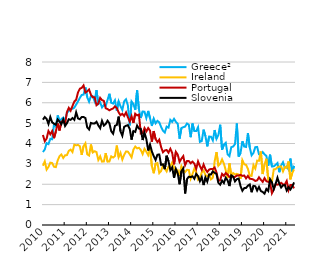
| Category | Greece² | Ireland | Portugal | Slovenia |
|---|---|---|---|---|
| 2010-01-31 | 3.58 | 2.91 | 4.42 | 5.17 |
| 2010-02-28 | 3.71 | 3.12 | 4.11 | 5.3 |
| 2010-03-31 | 4.02 | 2.72 | 4.24 | 5.21 |
| 2010-04-30 | 3.97 | 2.85 | 4.61 | 4.96 |
| 2010-05-31 | 4.23 | 3.06 | 4.45 | 5.3 |
| 2010-06-30 | 4.21 | 3.04 | 4.61 | 5.04 |
| 2010-07-31 | 4.94 | 2.86 | 4.26 | 4.97 |
| 2010-08-31 | 4.83 | 2.84 | 4.59 | 4.92 |
| 2010-09-30 | 5.38 | 3.17 | 4.98 | 5.18 |
| 2010-10-31 | 5.09 | 3.38 | 4.64 | 5.07 |
| 2010-11-30 | 5.2 | 3.46 | 5.07 | 4.95 |
| 2010-12-31 | 5.27 | 3.29 | 5.12 | 5.18 |
| 2011-01-31 | 5.12 | 3.42 | 4.97 | 4.86 |
| 2011-02-28 | 5.5 | 3.43 | 5.54 | 5 |
| 2011-03-31 | 5.6 | 3.64 | 5.75 | 5.19 |
| 2011-04-30 | 5.7 | 3.7 | 5.61 | 5.16 |
| 2011-05-31 | 5.7 | 3.58 | 5.84 | 5.25 |
| 2011-06-30 | 5.76 | 3.94 | 6.06 | 5.16 |
| 2011-07-31 | 5.91 | 3.91 | 6.15 | 5.53 |
| 2011-08-31 | 6.07 | 3.93 | 6.51 | 5.23 |
| 2011-09-30 | 6.24 | 3.87 | 6.69 | 5.19 |
| 2011-10-31 | 6.38 | 3.44 | 6.73 | 5.3 |
| 2011-11-30 | 6.4 | 3.87 | 6.85 | 5.3 |
| 2011-12-31 | 6.75 | 4.01 | 6.5 | 5.25 |
| 2012-01-31 | 6.27 | 3.47 | 6.56 | 4.79 |
| 2012-02-29 | 6.05 | 3.41 | 6.65 | 4.69 |
| 2012-03-31 | 6.33 | 3.95 | 6.39 | 5.01 |
| 2012-04-30 | 6.32 | 3.56 | 6.27 | 4.98 |
| 2012-05-31 | 6.08 | 3.62 | 6.27 | 4.98 |
| 2012-06-30 | 6.62 | 3.58 | 5.88 | 5.07 |
| 2012-07-31 | 5.94 | 3.19 | 5.96 | 4.89 |
| 2012-08-31 | 6.02 | 3.37 | 6.24 | 4.75 |
| 2012-09-30 | 5.77 | 3.11 | 6.13 | 5.11 |
| 2012-10-31 | 5.89 | 3.12 | 6.09 | 4.88 |
| 2012-11-30 | 5.85 | 3.53 | 5.73 | 4.96 |
| 2012-12-31 | 6.14 | 3.11 | 5.69 | 5.12 |
| 2013-01-31 | 6.44 | 3.12 | 5.63 | 4.99 |
| 2013-02-28 | 6 | 3.37 | 5.68 | 4.6 |
| 2013-03-31 | 5.96 | 3.31 | 5.72 | 4.48 |
| 2013-04-30 | 6.12 | 3.38 | 5.82 | 4.87 |
| 2013-05-31 | 5.61 | 3.9 | 5.74 | 4.91 |
| 2013-06-30 | 6.07 | 3.33 | 5.53 | 5.32 |
| 2013-07-31 | 5.83 | 3.54 | 5.39 | 4.6 |
| 2013-08-31 | 5.65 | 3.21 | 5.46 | 4.38 |
| 2013-09-30 | 6.07 | 3.44 | 5.35 | 4.82 |
| 2013-10-31 | 6.17 | 3.61 | 5.53 | 4.87 |
| 2013-11-30 | 5.87 | 3.6 | 5.29 | 4.9 |
| 2013-12-31 | 4.89 | 3.47 | 5.08 | 4.72 |
| 2014-01-31 | 6.06 | 3.32 | 5.34 | 4.19 |
| 2014-02-28 | 5.93 | 3.7 | 5.01 | 4.61 |
| 2014-03-31 | 5.65 | 3.85 | 5.46 | 4.57 |
| 2014-04-30 | 6.61 | 3.76 | 5.38 | 4.88 |
| 2014-05-31 | 5.66 | 3.79 | 5.42 | 4.73 |
| 2014-06-30 | 5.25 | 3.68 | 4.49 | 4.72 |
| 2014-07-31 | 5.57 | 3.48 | 4.52 | 4.17 |
| 2014-08-31 | 5.56 | 3.74 | 4.76 | 4.53 |
| 2014-09-30 | 5.25 | 3.6 | 4.59 | 4.22 |
| 2014-10-31 | 5.6 | 3.43 | 4.76 | 3.66 |
| 2014-11-30 | 5.24 | 3.77 | 4.63 | 3.95 |
| 2014-12-31 | 4.86 | 2.89 | 4.09 | 3.61 |
| 2015-01-31 | 5.22 | 2.54 | 4.61 | 3.38 |
| 2015-02-28 | 4.99 | 3.01 | 4.22 | 3.19 |
| 2015-03-31 | 5.11 | 3.04 | 4.07 | 3.45 |
| 2015-04-30 | 5.04 | 2.55 | 4.19 | 3.46 |
| 2015-05-31 | 4.81 | 2.65 | 3.82 | 2.95 |
| 2015-06-30 | 4.63 | 2.93 | 3.57 | 2.98 |
| 2015-07-31 | 4.54 | 2.77 | 3.66 | 2.74 |
| 2015-08-31 | 4.83 | 2.63 | 3.68 | 3.4 |
| 2015-09-30 | 4.78 | 2.87 | 3.55 | 3.13 |
| 2015-10-31 | 5.16 | 2.89 | 3.74 | 2.69 |
| 2015-11-30 | 5.06 | 3.07 | 3.54 | 2.83 |
| 2015-12-31 | 5.21 | 2.84 | 2.98 | 2.32 |
| 2016-01-31 | 5.06 | 2.55 | 3.59 | 2.75 |
| 2016-02-29 | 4.97 | 2.68 | 3.45 | 2.53 |
| 2016-03-31 | 4.24 | 2.41 | 3.1 | 2 |
| 2016-04-30 | 4.76 | 2.88 | 3.26 | 2.64 |
| 2016-05-31 | 4.8 | 2.67 | 3.38 | 2.78 |
| 2016-06-30 | 4.83 | 2.6 | 2.94 | 1.55 |
| 2016-07-31 | 4.98 | 2.71 | 3.14 | 2.25 |
| 2016-08-31 | 4.92 | 2.7 | 3.14 | 2.37 |
| 2016-09-30 | 4.31 | 2.27 | 3.03 | 2.35 |
| 2016-10-31 | 4.98 | 2.5 | 3.11 | 2.39 |
| 2016-11-30 | 4.61 | 2.77 | 3.01 | 2.27 |
| 2016-12-31 | 4.61 | 2.6 | 2.76 | 2.51 |
| 2017-01-31 | 4.8 | 2.22 | 3.12 | 2.4 |
| 2017-02-28 | 4.08 | 2.31 | 2.89 | 2.15 |
| 2017-03-31 | 4.12 | 2.58 | 2.71 | 2.35 |
| 2017-04-30 | 4.68 | 2.68 | 2.97 | 1.96 |
| 2017-05-31 | 4.36 | 2.45 | 2.74 | 2.33 |
| 2017-06-30 | 3.86 | 2.39 | 2.6 | 2.13 |
| 2017-07-31 | 4.34 | 2.49 | 2.72 | 2.48 |
| 2017-08-31 | 4.33 | 2.24 | 2.75 | 2.48 |
| 2017-09-30 | 4.15 | 2.32 | 2.74 | 2.63 |
| 2017-10-31 | 4.66 | 3.13 | 2.82 | 2.56 |
| 2017-11-30 | 4.23 | 3.58 | 2.58 | 2.5 |
| 2017-12-31 | 4.41 | 2.91 | 2.16 | 2.07 |
| 2018-01-31 | 4.92 | 3.01 | 2.21 | 1.98 |
| 2018-02-28 | 3.69 | 3.22 | 2.51 | 2.18 |
| 2018-03-31 | 3.94 | 3.01 | 2.41 | 2.06 |
| 2018-04-30 | 4.03 | 2.69 | 2.55 | 2.32 |
| 2018-05-31 | 3.47 | 2.3 | 2.47 | 2.19 |
| 2018-06-30 | 3.38 | 3.02 | 2.36 | 1.91 |
| 2018-07-31 | 3.82 | 2.43 | 2.37 | 2.44 |
| 2018-08-31 | 3.85 | 2.55 | 2.36 | 2.38 |
| 2018-09-30 | 3.97 | 2.48 | 2.36 | 2.14 |
| 2018-10-31 | 4.98 | 2.51 | 2.43 | 2.25 |
| 2018-11-30 | 3.36 | 2.48 | 2.43 | 2.28 |
| 2018-12-31 | 3.54 | 2.26 | 2.46 | 1.91 |
| 2019-01-31 | 4.11 | 3.18 | 2.41 | 1.68 |
| 2019-02-28 | 3.85 | 2.98 | 2.43 | 1.81 |
| 2019-03-31 | 3.83 | 2.95 | 2.29 | 1.82 |
| 2019-04-30 | 4.51 | 2.76 | 2.41 | 1.93 |
| 2019-05-31 | 3.8 | 2.42 | 2.27 | 1.99 |
| 2019-06-30 | 3.42 | 2.41 | 2.26 | 1.61 |
| 2019-07-31 | 3.54 | 2.94 | 2.23 | 1.92 |
| 2019-08-31 | 3.82 | 2.77 | 2.16 | 1.9 |
| 2019-09-30 | 3.83 | 3.16 | 2.19 | 1.69 |
| 2019-10-31 | 3.47 | 3.15 | 2.34 | 1.87 |
| 2019-11-30 | 3.46 | 3.61 | 2.22 | 1.67 |
| 2019-12-31 | 3.58 | 2.5 | 2.12 | 1.62 |
| 2020-01-31 | 3.47 | 2.97 | 2.3 | 1.54 |
| 2020-02-29 | 3.39 | 3.25 | 2.15 | 1.77 |
| 2020-03-31 | 2.91 | 2.22 | 2.12 | 1.67 |
| 2020-04-30 | 3.45 | 2.12 | 2.08 | 2.25 |
| 2020-05-31 | 2.87 | 2.12 | 1.56 | 2.1 |
| 2020-06-30 | 2.88 | 2.73 | 1.75 | 1.76 |
| 2020-07-31 | 2.95 | 2.74 | 2 | 2.02 |
| 2020-08-31 | 3.04 | 2.83 | 1.98 | 2.32 |
| 2020-09-30 | 2.59 | 2.87 | 2 | 2.03 |
| 2020-10-31 | 2.92 | 2.87 | 2.07 | 1.84 |
| 2020-11-30 | 3.08 | 2.63 | 1.99 | 1.95 |
| 2020-12-31 | 2.81 | 2.85 | 1.99 | 1.96 |
| 2021-01-31 | 2.87 | 2.8 | 2.16 | 1.69 |
| 2021-02-28 | 2.73 | 3.12 | 1.71 | 1.86 |
| 2021-03-31 | 3.26 | 2.24 | 1.96 | 1.74 |
| 2021-04-30 | 2.62 | 2.55 | 1.96 | 1.89 |
| 2021-05-31 | 2.9 | 2.73 | 1.8 | 2.09 |